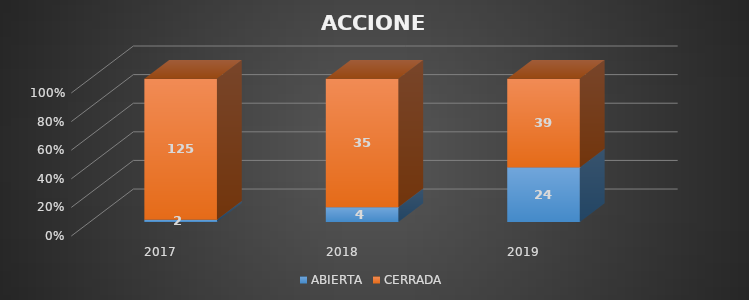
| Category | ABIERTA | CERRADA |
|---|---|---|
| 2017.0 | 2 | 125 |
| 2018.0 | 4 | 35 |
| 2019.0 | 24 | 39 |